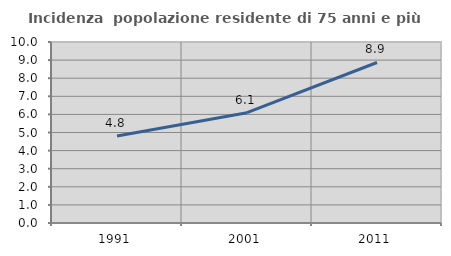
| Category | Incidenza  popolazione residente di 75 anni e più |
|---|---|
| 1991.0 | 4.807 |
| 2001.0 | 6.095 |
| 2011.0 | 8.868 |